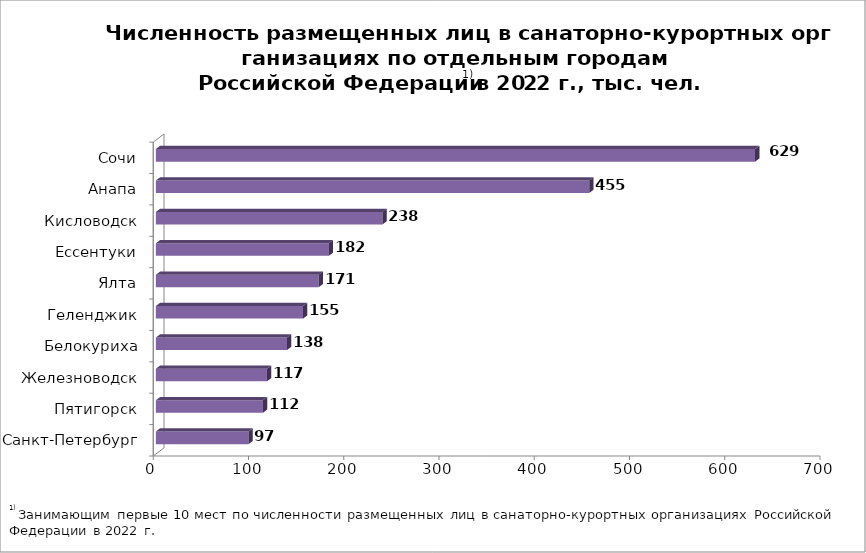
| Category | Series 0 |
|---|---|
| Санкт-Петербург | 97.308 |
| Пятигорск | 112.467 |
| Железноводск | 116.651 |
| Белокуриха | 137.766 |
| Геленджик | 154.559 |
| Ялта | 170.994 |
| Ессентуки | 181.599 |
| Кисловодск | 237.982 |
| Анапа | 454.893 |
| Сочи | 629.157 |